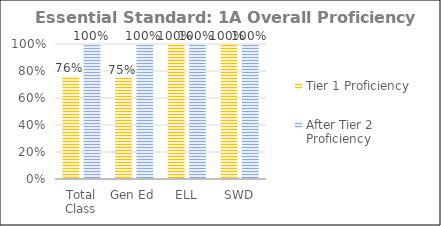
| Category | Tier 1 Proficiency | After Tier 2 Proficiency |
|---|---|---|
| Total Class | 0.763 | 1 |
| Gen Ed | 0.75 | 1 |
| ELL | 1 | 1 |
| SWD | 1 | 1 |